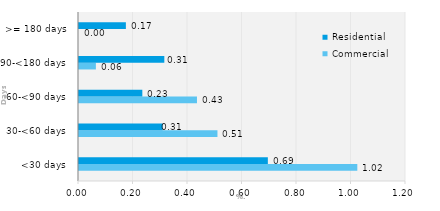
| Category | Commercial | Residential |
|---|---|---|
| <30 days | 1.021 | 0.693 |
| 30-<60 days | 0.508 | 0.307 |
| 60-<90 days | 0.433 | 0.232 |
| 90-<180 days | 0.062 | 0.313 |
| >= 180 days | 0 | 0.172 |